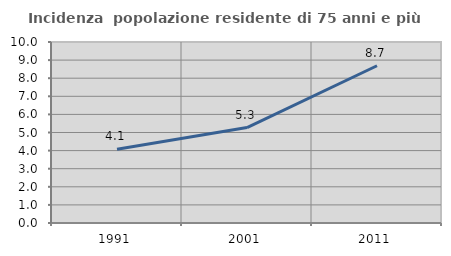
| Category | Incidenza  popolazione residente di 75 anni e più |
|---|---|
| 1991.0 | 4.071 |
| 2001.0 | 5.275 |
| 2011.0 | 8.687 |